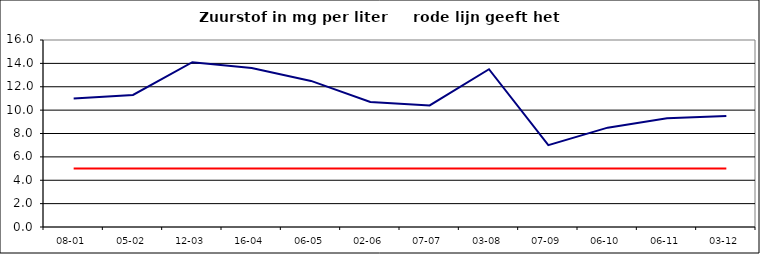
| Category | Series 0 | Series 1 |
|---|---|---|
| 08-01 | 11 | 5 |
| 05-02 | 11.3 | 5 |
| 12-03 | 14.1 | 5 |
| 16-04 | 13.6 | 5 |
| 06-05 | 12.5 | 5 |
| 02-06 | 10.7 | 5 |
| 07-07 | 10.4 | 5 |
| 03-08 | 13.5 | 5 |
| 07-09 | 7 | 5 |
| 06-10 | 8.5 | 5 |
| 06-11 | 9.3 | 5 |
| 03-12 | 9.5 | 5 |